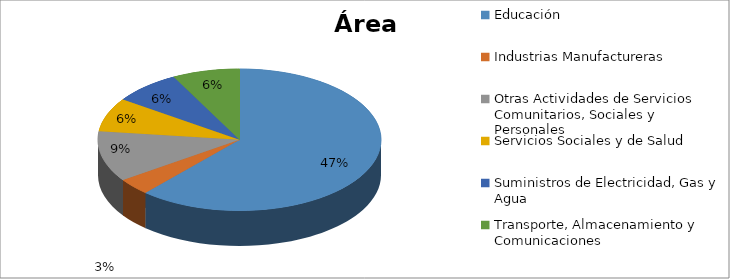
| Category | Series 0 |
|---|---|
| Educación | 0.471 |
| Industrias Manufactureras | 0.029 |
| Otras Actividades de Servicios Comunitarios, Sociales y Personales | 0.088 |
| Servicios Sociales y de Salud | 0.059 |
| Suministros de Electricidad, Gas y Agua | 0.059 |
| Transporte, Almacenamiento y Comunicaciones | 0.059 |